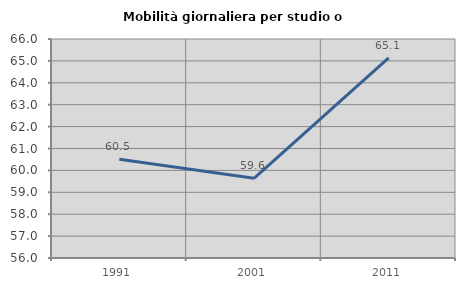
| Category | Mobilità giornaliera per studio o lavoro |
|---|---|
| 1991.0 | 60.511 |
| 2001.0 | 59.641 |
| 2011.0 | 65.136 |